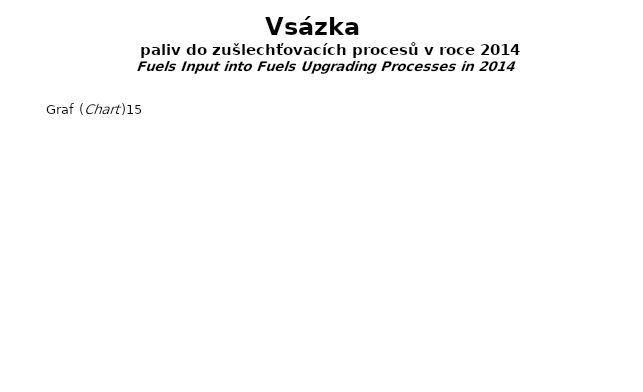
| Category | Series 0 |
|---|---|
| Hnědé uhlí (Brown Coal) | 0 |
| ČU vhodné pro koksování (Coking Coal) | 0 |
| Ropa (Crude Oil) | 0 |
| Ost. paliva (Other Fuels) | 0 |
| Koks (Coke) | 0 |